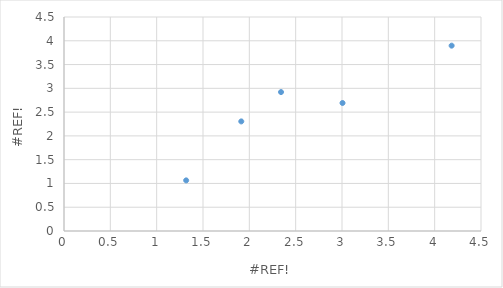
| Category | X2 |
|---|---|
| 1.3183234402292117 | 1.065 |
| 2.3419931235491895 | 2.921 |
| 1.9131190638660969 | 2.304 |
| 3.005573770053918 | 2.692 |
| 4.183120957658426 | 3.897 |